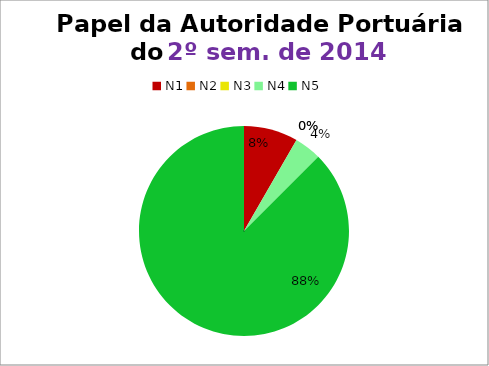
| Category | 2º/14 |
|---|---|
| N1 | 2 |
| N2 | 0 |
| N3 | 0 |
| N4 | 1 |
| N5 | 21 |